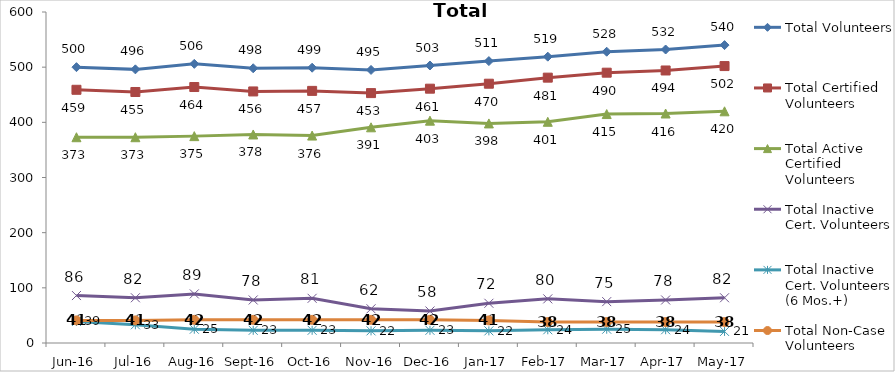
| Category | Total Volunteers | Total Certified Volunteers | Total Active Certified Volunteers | Total Inactive Cert. Volunteers | Total Inactive Cert. Volunteers (6 Mos.+) | Total Non-Case Volunteers |
|---|---|---|---|---|---|---|
| Jun-16 | 500 | 459 | 373 | 86 | 39 | 41 |
| Jul-16 | 496 | 455 | 373 | 82 | 33 | 41 |
| Aug-16 | 506 | 464 | 375 | 89 | 25 | 42 |
| Sep-16 | 498 | 456 | 378 | 78 | 23 | 42 |
| Oct-16 | 499 | 457 | 376 | 81 | 23 | 42 |
| Nov-16 | 495 | 453 | 391 | 62 | 22 | 42 |
| Dec-16 | 503 | 461 | 403 | 58 | 23 | 42 |
| Jan-17 | 511 | 470 | 398 | 72 | 22 | 41 |
| Feb-17 | 519 | 481 | 401 | 80 | 24 | 38 |
| Mar-17 | 528 | 490 | 415 | 75 | 25 | 38 |
| Apr-17 | 532 | 494 | 416 | 78 | 24 | 38 |
| May-17 | 540 | 502 | 420 | 82 | 21 | 38 |